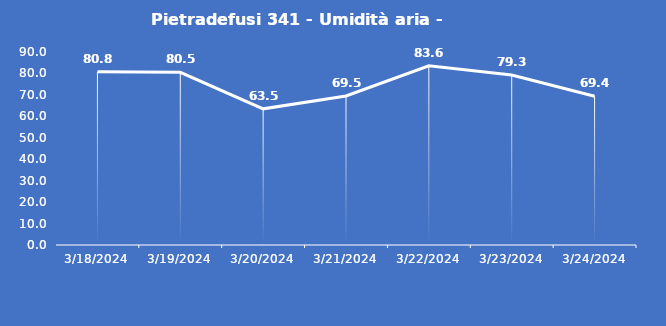
| Category | Pietradefusi 341 - Umidità aria - Grezzo (%) |
|---|---|
| 3/18/24 | 80.8 |
| 3/19/24 | 80.5 |
| 3/20/24 | 63.5 |
| 3/21/24 | 69.5 |
| 3/22/24 | 83.6 |
| 3/23/24 | 79.3 |
| 3/24/24 | 69.4 |